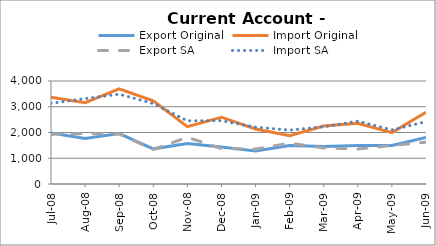
| Category | Export Original | Import Original | Export SA | Import SA |
|---|---|---|---|---|
| 2008-07-31 | 1980.5 | 3366 | 1934 | 3132 |
| 2008-08-31 | 1771 | 3158 | 1960 | 3315 |
| 2008-09-30 | 1960 | 3694 | 1940 | 3488 |
| 2008-10-31 | 1365 | 3227 | 1343 | 3124 |
| 2008-11-30 | 1575 | 2225 | 1813 | 2453 |
| 2008-12-31 | 1438 | 2594 | 1376 | 2459 |
| 2009-01-31 | 1282 | 2138 | 1355 | 2207 |
| 2009-02-28 | 1499 | 1875 | 1586 | 2092 |
| 2009-03-31 | 1454 | 2249 | 1398 | 2223 |
| 2009-04-30 | 1497 | 2359 | 1359 | 2442 |
| 2009-05-31 | 1496 | 1994 | 1494 | 2101 |
| 2009-06-30 | 1808 | 2786 | 1625 | 2421 |